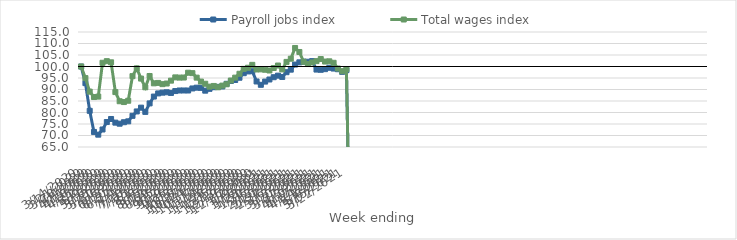
| Category | Payroll jobs index | Total wages index |
|---|---|---|
| 14/03/2020 | 100 | 100 |
| 21/03/2020 | 92.763 | 94.956 |
| 28/03/2020 | 80.733 | 89.073 |
| 04/04/2020 | 71.548 | 86.721 |
| 11/04/2020 | 70.363 | 86.911 |
| 18/04/2020 | 72.61 | 101.622 |
| 25/04/2020 | 75.85 | 102.322 |
| 02/05/2020 | 77.177 | 101.821 |
| 09/05/2020 | 75.592 | 88.873 |
| 16/05/2020 | 75.129 | 84.895 |
| 23/05/2020 | 75.768 | 84.54 |
| 30/05/2020 | 76.159 | 85.11 |
| 06/06/2020 | 78.548 | 95.807 |
| 13/06/2020 | 80.46 | 99.195 |
| 20/06/2020 | 82.109 | 94.749 |
| 27/06/2020 | 80.26 | 90.961 |
| 04/07/2020 | 83.957 | 95.866 |
| 11/07/2020 | 86.924 | 92.679 |
| 18/07/2020 | 88.299 | 92.866 |
| 25/07/2020 | 88.632 | 92.328 |
| 01/08/2020 | 88.792 | 92.599 |
| 08/08/2020 | 88.5 | 93.846 |
| 15/08/2020 | 89.322 | 95.268 |
| 22/08/2020 | 89.568 | 95.171 |
| 29/08/2020 | 89.572 | 95.197 |
| 05/09/2020 | 89.559 | 97.299 |
| 12/09/2020 | 90.451 | 97.111 |
| 19/09/2020 | 90.793 | 95.158 |
| 26/09/2020 | 90.7 | 93.447 |
| 03/10/2020 | 89.492 | 92.499 |
| 10/10/2020 | 90.287 | 91.244 |
| 17/10/2020 | 90.989 | 91.546 |
| 24/10/2020 | 91.156 | 90.968 |
| 31/10/2020 | 91.318 | 91.687 |
| 07/11/2020 | 92.476 | 92.27 |
| 14/11/2020 | 93.705 | 93.912 |
| 21/11/2020 | 94.127 | 95.159 |
| 28/11/2020 | 95.117 | 96.842 |
| 05/12/2020 | 97.082 | 98.964 |
| 12/12/2020 | 97.856 | 99.453 |
| 19/12/2020 | 97.948 | 100.716 |
| 26/12/2020 | 93.491 | 98.706 |
| 02/01/2021 | 92.044 | 98.755 |
| 09/01/2021 | 93.44 | 98.589 |
| 16/01/2021 | 94.351 | 98.267 |
| 23/01/2021 | 95.342 | 99.342 |
| 30/01/2021 | 96.025 | 100.425 |
| 06/02/2021 | 95.452 | 98.748 |
| 13/02/2021 | 97.524 | 101.999 |
| 20/02/2021 | 98.624 | 103.388 |
| 27/02/2021 | 100.841 | 108.051 |
| 06/03/2021 | 101.813 | 106.308 |
| 13/03/2021 | 102.117 | 102.06 |
| 20/03/2021 | 102.07 | 101.07 |
| 27/03/2021 | 102.345 | 101.764 |
| 03/04/2021 | 98.663 | 102.34 |
| 10/04/2021 | 98.561 | 103.244 |
| 17/04/2021 | 98.852 | 102.158 |
| 24/04/2021 | 99.442 | 102.251 |
| 01/05/2021 | 99.108 | 101.616 |
| 08/05/2021 | 98.817 | 99.136 |
| 15/05/2021 | 97.674 | 97.957 |
| 22/05/2021 | 98.405 | 98.912 |